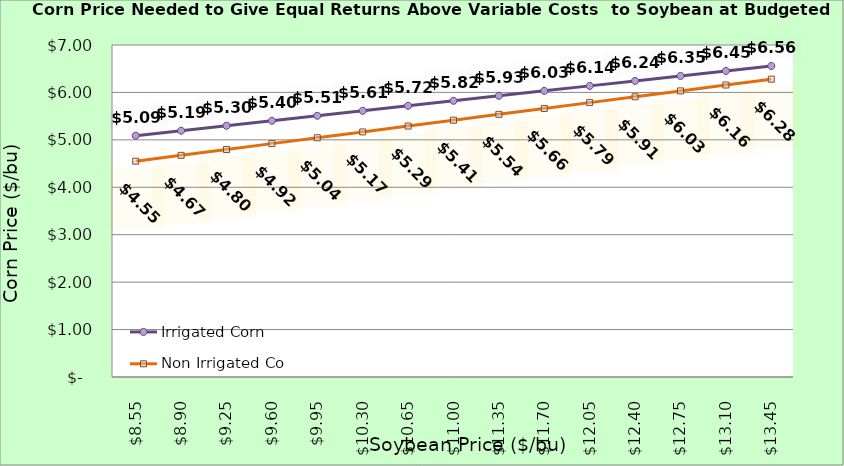
| Category | Irrigated Corn | Non Irrigated Corn |
|---|---|---|
| 8.550000000000002 | 5.088 | 4.55 |
| 8.900000000000002 | 5.193 | 4.673 |
| 9.250000000000002 | 5.298 | 4.797 |
| 9.600000000000001 | 5.403 | 4.92 |
| 9.950000000000001 | 5.508 | 5.044 |
| 10.3 | 5.613 | 5.168 |
| 10.65 | 5.718 | 5.291 |
| 11.0 | 5.823 | 5.415 |
| 11.35 | 5.928 | 5.538 |
| 11.7 | 6.033 | 5.662 |
| 12.049999999999999 | 6.138 | 5.785 |
| 12.399999999999999 | 6.243 | 5.909 |
| 12.749999999999998 | 6.348 | 6.032 |
| 13.099999999999998 | 6.453 | 6.156 |
| 13.449999999999998 | 6.558 | 6.279 |